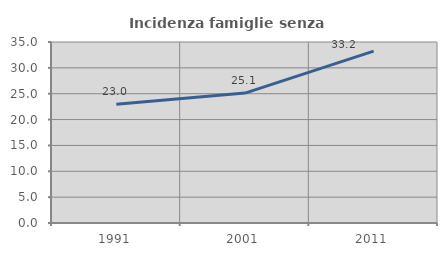
| Category | Incidenza famiglie senza nuclei |
|---|---|
| 1991.0 | 22.951 |
| 2001.0 | 25.117 |
| 2011.0 | 33.223 |